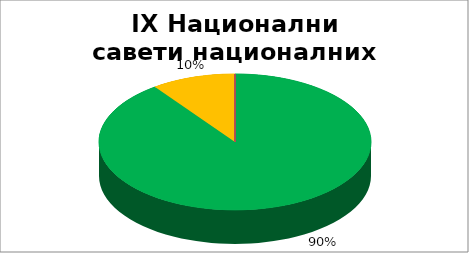
| Category | IX Национални савети националних мањина |
|---|---|
| 0 | 0.9 |
| 1 | 0.1 |
| 2 | 0 |
| 3 | 0 |
| 4 | 0 |